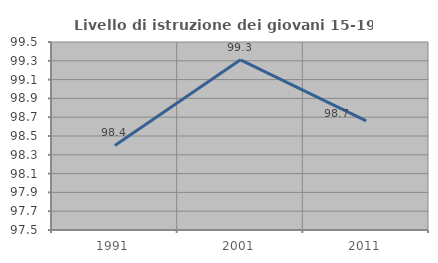
| Category | Livello di istruzione dei giovani 15-19 anni |
|---|---|
| 1991.0 | 98.4 |
| 2001.0 | 99.31 |
| 2011.0 | 98.661 |